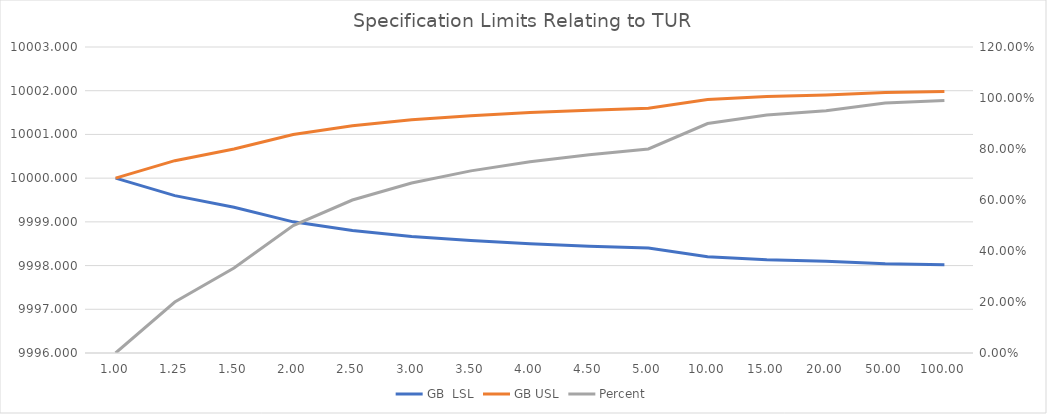
| Category | GB  | GB |
|---|---|---|
| 1.0 | 10000 | 10000 |
| 1.25 | 9999.6 | 10000.4 |
| 1.5 | 9999.333 | 10000.667 |
| 2.0 | 9999 | 10001 |
| 2.5 | 9998.8 | 10001.2 |
| 3.0 | 9998.667 | 10001.333 |
| 3.5 | 9998.571 | 10001.429 |
| 4.0 | 9998.5 | 10001.5 |
| 4.5 | 9998.444 | 10001.556 |
| 5.0 | 9998.4 | 10001.6 |
| 10.0 | 9998.2 | 10001.8 |
| 15.0 | 9998.133 | 10001.867 |
| 20.0 | 9998.1 | 10001.9 |
| 50.0 | 9998.04 | 10001.96 |
| 100.0 | 9998.02 | 10001.98 |